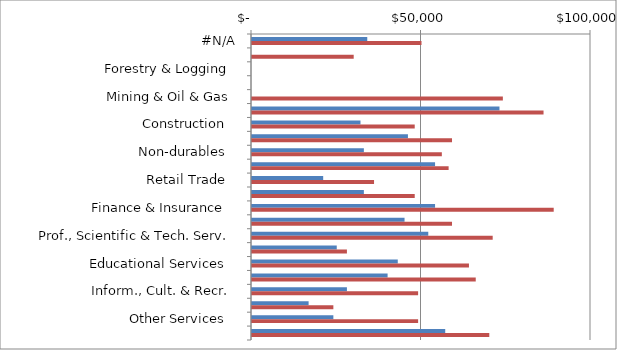
| Category | Series 0 | Series 1 |
|---|---|---|
|  #N/A  | 34000 | 50000 |
|  Agriculture   | 0 | 30000 |
|  Forestry & Logging  | 0 | 0 |
|  Fishing, Hunting & Trapping   | 0 | 0 |
|  Mining & Oil & Gas  | 0 | 74000 |
|  Utilities   | 73000 | 86000 |
|  Construction   | 32000 | 48000 |
|  Durables   | 46000 | 59000 |
|  Non-durables   | 33000 | 56000 |
|  Wholesale Trade   | 54000 | 58000 |
|  Retail Trade   | 21000 | 36000 |
|  Transportation & Warehousing   | 33000 | 48000 |
|  Finance & Insurance   | 54000 | 89000 |
|  Real Estate & Leasing   | 45000 | 59000 |
|  Prof., Scientific & Tech. Serv.  | 52000 | 71000 |
|  Bus., building & support serv.  | 25000 | 28000 |
|  Educational Services   | 43000 | 64000 |
|  Health Care & Social Assistance   | 40000 | 66000 |
|  Inform., Cult. & Recr.  | 28000 | 49000 |
|  Accomm. & Food Services   | 16700 | 24000 |
|  Other Services   | 24000 | 49000 |
|  Public Administration   | 57000 | 70000 |